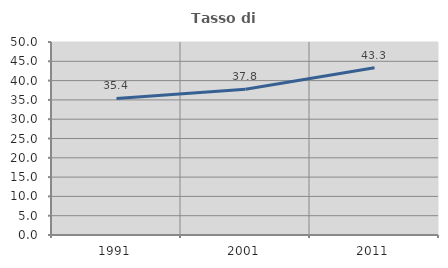
| Category | Tasso di occupazione   |
|---|---|
| 1991.0 | 35.373 |
| 2001.0 | 37.763 |
| 2011.0 | 43.337 |